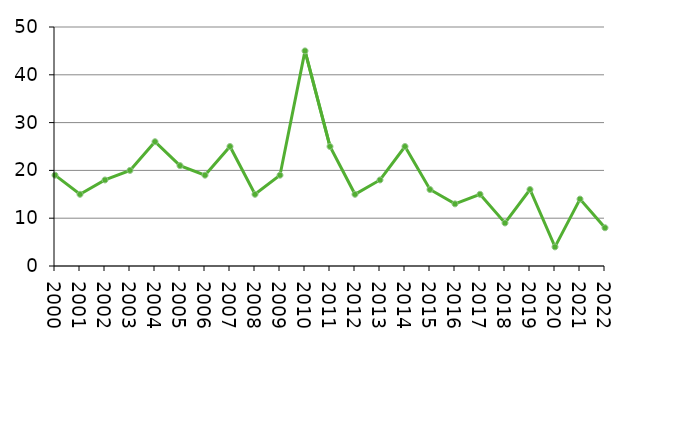
| Category | Avlidna |
|---|---|
| 2000 | 19 |
| 2001 | 15 |
| 2002 | 18 |
| 2003 | 20 |
| 2004 | 26 |
| 2005 | 21 |
| 2006 | 19 |
| 2007 | 25 |
| 2008 | 15 |
| 2009 | 19 |
| 2010 | 45 |
| 2011 | 25 |
| 2012 | 15 |
| 2013 | 18 |
| 2014 | 25 |
| 2015 | 16 |
| 2016 | 13 |
| 2017 | 15 |
| 2018 | 9 |
| 2019 | 16 |
| 2020 | 4 |
| 2021 | 14 |
| 2022 | 8 |